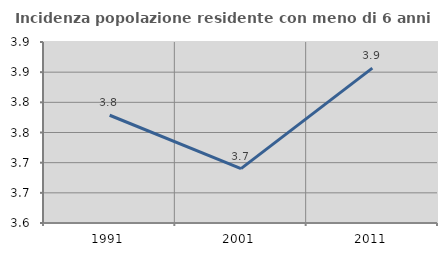
| Category | Incidenza popolazione residente con meno di 6 anni |
|---|---|
| 1991.0 | 3.779 |
| 2001.0 | 3.69 |
| 2011.0 | 3.857 |